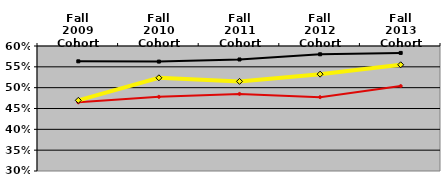
| Category | NATIONAL MEDIAN | WEST MEDIAN | TEXAS LUTHERAN |
|---|---|---|---|
| Fall 2009 Cohort | 0.563 | 0.465 | 0.47 |
| Fall 2010 Cohort | 0.563 | 0.478 | 0.524 |
| Fall 2011 Cohort | 0.568 | 0.485 | 0.515 |
| Fall 2012 Cohort | 0.58 | 0.477 | 0.532 |
| Fall 2013 Cohort | 0.583 | 0.504 | 0.555 |